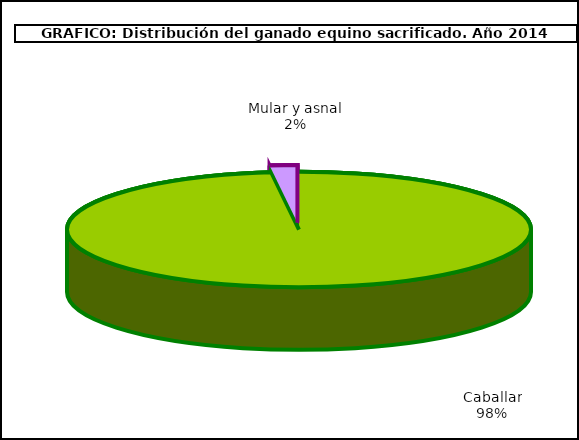
| Category | Series 0 |
|---|---|
| Caballar | 47193 |
| Mular y asnal | 922 |